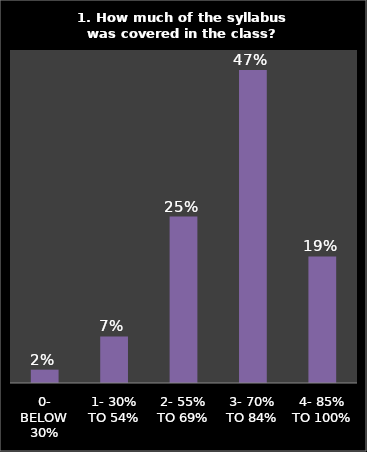
| Category | Series 0 |
|---|---|
| 0- BELOW 30% | 0.02 |
| 1- 30% TO 54% | 0.07 |
| 2- 55% TO 69% | 0.25 |
| 3- 70% TO 84% | 0.47 |
| 4- 85% TO 100% | 0.19 |